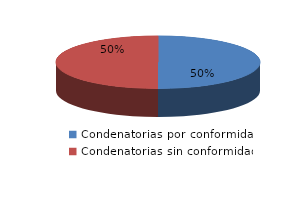
| Category | Series 0 |
|---|---|
| 0 | 8 |
| 1 | 8 |